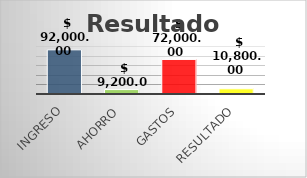
| Category | Series 0 |
|---|---|
| Ingreso | 92000 |
| Ahorro | 9200 |
| Gastos | 72000 |
| Resultado | 10800 |